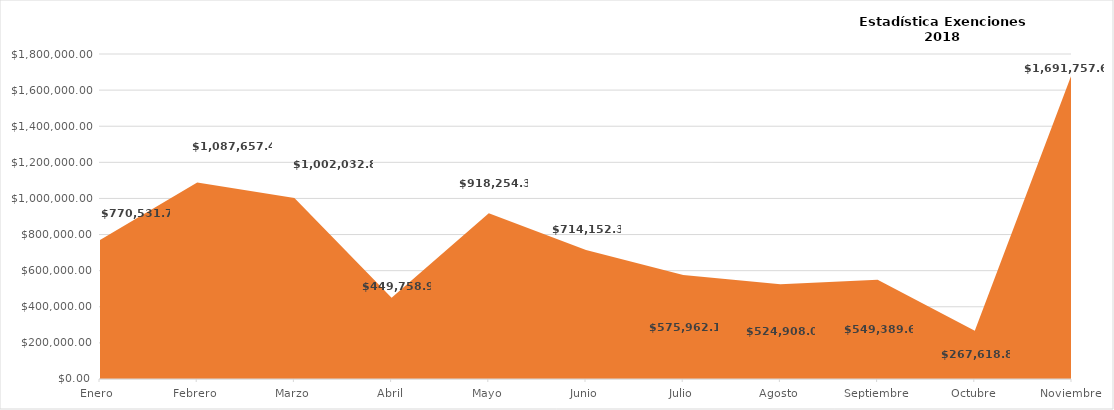
| Category | Total de Monto Condonado |
|---|---|
| Enero  | 770531.74 |
| Febrero | 1087657.45 |
| Marzo | 1002032.81 |
| Abril | 449758.99 |
| Mayo | 918254.35 |
| Junio | 714152.37 |
| Julio | 575962.18 |
| Agosto | 524908.05 |
| Septiembre | 549389.62 |
| Octubre | 267618.85 |
| Noviembre | 1691757.61 |